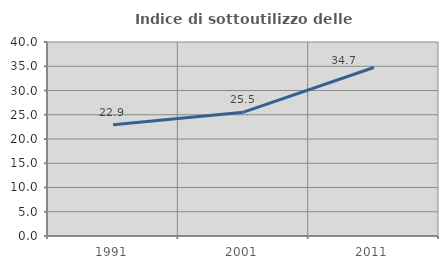
| Category | Indice di sottoutilizzo delle abitazioni  |
|---|---|
| 1991.0 | 22.917 |
| 2001.0 | 25.538 |
| 2011.0 | 34.741 |